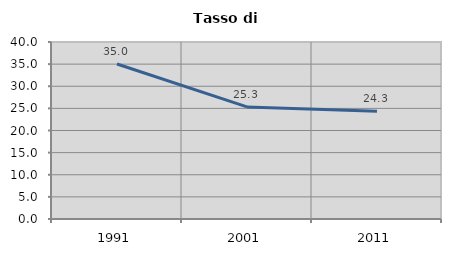
| Category | Tasso di disoccupazione   |
|---|---|
| 1991.0 | 35.033 |
| 2001.0 | 25.324 |
| 2011.0 | 24.344 |